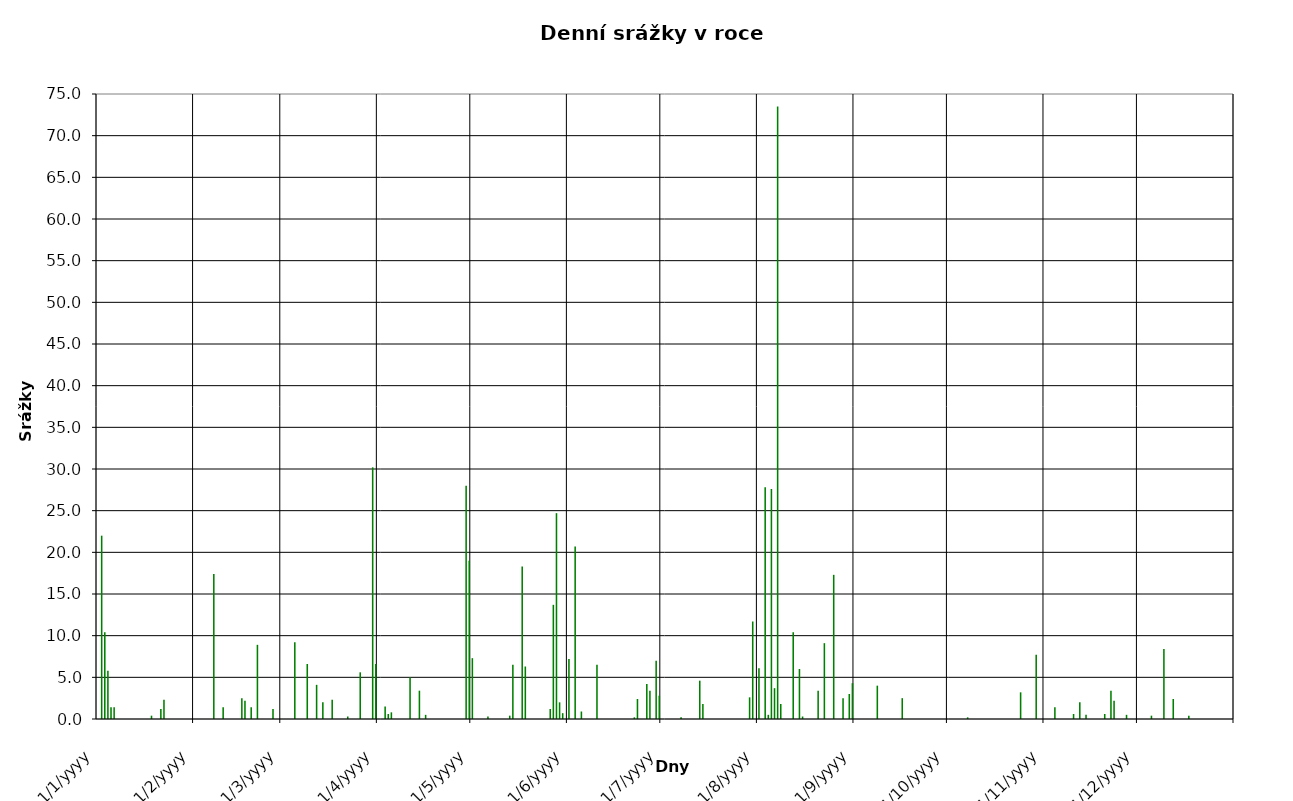
| Category | Series 0 |
|---|---|
| 2006-01-01 | 0 |
| 2006-01-02 | 22 |
| 2006-01-03 | 10.4 |
| 2006-01-04 | 5.8 |
| 2006-01-05 | 1.4 |
| 2006-01-06 | 1.4 |
| 2006-01-07 | 0 |
| 2006-01-08 | 0 |
| 2006-01-09 | 0 |
| 2006-01-10 | 0 |
| 2006-01-11 | 0 |
| 2006-01-12 | 0 |
| 2006-01-13 | 0 |
| 2006-01-14 | 0 |
| 2006-01-15 | 0 |
| 2006-01-16 | 0 |
| 2006-01-17 | 0 |
| 2006-01-18 | 0.4 |
| 2006-01-19 | 0 |
| 2006-01-20 | 0 |
| 2006-01-21 | 1.2 |
| 2006-01-22 | 2.3 |
| 2006-01-23 | 0 |
| 2006-01-24 | 0 |
| 2006-01-25 | 0 |
| 2006-01-26 | 0 |
| 2006-01-27 | 0 |
| 2006-01-28 | 0 |
| 2006-01-29 | 0 |
| 2006-01-30 | 0 |
| 2006-01-31 | 0 |
| 2006-02-01 | 0 |
| 2006-02-02 | 0 |
| 2006-02-03 | 0 |
| 2006-02-04 | 0 |
| 2006-02-05 | 0 |
| 2006-02-06 | 0 |
| 2006-02-07 | 17.4 |
| 2006-02-08 | 0 |
| 2006-02-09 | 0 |
| 2006-02-10 | 1.4 |
| 2006-02-11 | 0 |
| 2006-02-12 | 0 |
| 2006-02-13 | 0 |
| 2006-02-14 | 0 |
| 2006-02-15 | 0 |
| 2006-02-16 | 2.5 |
| 2006-02-17 | 2.2 |
| 2006-02-18 | 0 |
| 2006-02-19 | 1.4 |
| 2006-02-20 | 0 |
| 2006-02-21 | 8.9 |
| 2006-02-22 | 0 |
| 2006-02-23 | 0 |
| 2006-02-24 | 0 |
| 2006-02-25 | 0 |
| 2006-02-26 | 1.2 |
| 2006-02-27 | 0 |
| 2006-02-28 | 0 |
| 2006-03-01 | 0 |
| 2006-03-02 | 0 |
| 2006-03-03 | 0 |
| 2006-03-04 | 0 |
| 2006-03-05 | 9.2 |
| 2006-03-06 | 0 |
| 2006-03-07 | 0 |
| 2006-03-08 | 0 |
| 2006-03-09 | 6.6 |
| 2006-03-10 | 0 |
| 2006-03-11 | 0 |
| 2006-03-12 | 4.1 |
| 2006-03-13 | 0 |
| 2006-03-14 | 2 |
| 2006-03-15 | 0 |
| 2006-03-16 | 0 |
| 2006-03-17 | 2.3 |
| 2006-03-18 | 0 |
| 2006-03-19 | 0 |
| 2006-03-20 | 0 |
| 2006-03-21 | 0 |
| 2006-03-22 | 0.3 |
| 2006-03-23 | 0 |
| 2006-03-24 | 0 |
| 2006-03-25 | 0 |
| 2006-03-26 | 5.6 |
| 2006-03-27 | 0 |
| 2006-03-28 | 0 |
| 2006-03-29 | 0 |
| 2006-03-30 | 30.2 |
| 2006-03-31 | 6.6 |
| 2006-04-01 | 0 |
| 2006-04-02 | 0 |
| 2006-04-03 | 1.5 |
| 2006-04-04 | 0.6 |
| 2006-04-05 | 0.8 |
| 2006-04-06 | 0 |
| 2006-04-07 | 0 |
| 2006-04-08 | 0 |
| 2006-04-09 | 0 |
| 2006-04-10 | 0 |
| 2006-04-11 | 5 |
| 2006-04-12 | 0 |
| 2006-04-13 | 0 |
| 2006-04-14 | 3.4 |
| 2006-04-15 | 0 |
| 2006-04-16 | 0.5 |
| 2006-04-17 | 0 |
| 2006-04-18 | 0 |
| 2006-04-19 | 0 |
| 2006-04-20 | 0 |
| 2006-04-21 | 0 |
| 2006-04-22 | 0 |
| 2006-04-23 | 0 |
| 2006-04-24 | 0 |
| 2006-04-25 | 0 |
| 2006-04-26 | 0 |
| 2006-04-27 | 0 |
| 2006-04-28 | 0 |
| 2006-04-29 | 28 |
| 2006-04-30 | 19 |
| 2006-05-01 | 7.3 |
| 2006-05-02 | 0 |
| 2006-05-03 | 0 |
| 2006-05-04 | 0 |
| 2006-05-05 | 0 |
| 2006-05-06 | 0.3 |
| 2006-05-07 | 0 |
| 2006-05-08 | 0 |
| 2006-05-09 | 0 |
| 2006-05-10 | 0 |
| 2006-05-11 | 0 |
| 2006-05-12 | 0 |
| 2006-05-13 | 0.4 |
| 2006-05-14 | 6.5 |
| 2006-05-15 | 0 |
| 2006-05-16 | 0 |
| 2006-05-17 | 18.3 |
| 2006-05-18 | 6.3 |
| 2006-05-19 | 0 |
| 2006-05-20 | 0 |
| 2006-05-21 | 0 |
| 2006-05-22 | 0 |
| 2006-05-23 | 0 |
| 2006-05-24 | 0 |
| 2006-05-25 | 0 |
| 2006-05-26 | 1.2 |
| 2006-05-27 | 13.7 |
| 2006-05-28 | 24.7 |
| 2006-05-29 | 2 |
| 2006-05-30 | 0.7 |
| 2006-05-31 | 0 |
| 2006-06-01 | 7.2 |
| 2006-06-02 | 0 |
| 2006-06-03 | 20.7 |
| 2006-06-04 | 0 |
| 2006-06-05 | 0.9 |
| 2006-06-06 | 0 |
| 2006-06-07 | 0 |
| 2006-06-08 | 0 |
| 2006-06-09 | 0 |
| 2006-06-10 | 6.5 |
| 2006-06-11 | 0 |
| 2006-06-12 | 0 |
| 2006-06-13 | 0 |
| 2006-06-14 | 0 |
| 2006-06-15 | 0 |
| 2006-06-16 | 0 |
| 2006-06-17 | 0 |
| 2006-06-18 | 0 |
| 2006-06-19 | 0 |
| 2006-06-20 | 0 |
| 2006-06-21 | 0 |
| 2006-06-22 | 0.2 |
| 2006-06-23 | 2.4 |
| 2006-06-24 | 0 |
| 2006-06-25 | 0 |
| 2006-06-26 | 4.2 |
| 2006-06-27 | 3.4 |
| 2006-06-28 | 0 |
| 2006-06-29 | 7 |
| 2006-06-30 | 2.8 |
| 2006-07-01 | 0 |
| 2006-07-02 | 0 |
| 2006-07-03 | 0 |
| 2006-07-04 | 0 |
| 2006-07-05 | 0 |
| 2006-07-06 | 0 |
| 2006-07-07 | 0.2 |
| 2006-07-08 | 0 |
| 2006-07-09 | 0 |
| 2006-07-10 | 0 |
| 2006-07-11 | 0 |
| 2006-07-12 | 0 |
| 2006-07-13 | 4.6 |
| 2006-07-14 | 1.8 |
| 2006-07-15 | 0 |
| 2006-07-16 | 0 |
| 2006-07-17 | 0 |
| 2006-07-18 | 0 |
| 2006-07-19 | 0 |
| 2006-07-20 | 0 |
| 2006-07-21 | 0 |
| 2006-07-22 | 0 |
| 2006-07-23 | 0 |
| 2006-07-24 | 0 |
| 2006-07-25 | 0 |
| 2006-07-26 | 0 |
| 2006-07-27 | 0 |
| 2006-07-28 | 0 |
| 2006-07-29 | 2.6 |
| 2006-07-30 | 11.7 |
| 2006-07-31 | 0 |
| 2006-08-01 | 6.1 |
| 2006-08-02 | 0 |
| 2006-08-03 | 27.8 |
| 2006-08-04 | 0.5 |
| 2006-08-05 | 27.6 |
| 2006-08-06 | 3.7 |
| 2006-08-07 | 73.5 |
| 2006-08-08 | 1.8 |
| 2006-08-09 | 0 |
| 2006-08-10 | 0 |
| 2006-08-11 | 0 |
| 2006-08-12 | 10.4 |
| 2006-08-13 | 0 |
| 2006-08-14 | 6 |
| 2006-08-15 | 0.3 |
| 2006-08-16 | 0 |
| 2006-08-17 | 0 |
| 2006-08-18 | 0 |
| 2006-08-19 | 0 |
| 2006-08-20 | 3.4 |
| 2006-08-21 | 0 |
| 2006-08-22 | 9.1 |
| 2006-08-23 | 0 |
| 2006-08-24 | 0 |
| 2006-08-25 | 17.3 |
| 2006-08-26 | 0 |
| 2006-08-27 | 0 |
| 2006-08-28 | 2.5 |
| 2006-08-29 | 0 |
| 2006-08-30 | 3 |
| 2006-08-31 | 4.3 |
| 2006-09-01 | 0 |
| 2006-09-02 | 0 |
| 2006-09-03 | 0 |
| 2006-09-04 | 0 |
| 2006-09-05 | 0 |
| 2006-09-06 | 0 |
| 2006-09-07 | 0 |
| 2006-09-08 | 4 |
| 2006-09-09 | 0 |
| 2006-09-10 | 0 |
| 2006-09-11 | 0 |
| 2006-09-12 | 0 |
| 2006-09-13 | 0 |
| 2006-09-14 | 0 |
| 2006-09-15 | 0 |
| 2006-09-16 | 2.5 |
| 2006-09-17 | 0 |
| 2006-09-18 | 0 |
| 2006-09-19 | 0 |
| 2006-09-20 | 0 |
| 2006-09-21 | 0 |
| 2006-09-22 | 0 |
| 2006-09-23 | 0 |
| 2006-09-24 | 0 |
| 2006-09-25 | 0 |
| 2006-09-26 | 0 |
| 2006-09-27 | 0 |
| 2006-09-28 | 0 |
| 2006-09-29 | 0 |
| 2006-09-30 | 0 |
| 2006-10-01 | 0 |
| 2006-10-02 | 0 |
| 2006-10-03 | 0 |
| 2006-10-04 | 0 |
| 2006-10-05 | 0 |
| 2006-10-06 | 0 |
| 2006-10-07 | 0.2 |
| 2006-10-08 | 0 |
| 2006-10-09 | 0 |
| 2006-10-10 | 0 |
| 2006-10-11 | 0 |
| 2006-10-12 | 0 |
| 2006-10-13 | 0 |
| 2006-10-14 | 0 |
| 2006-10-15 | 0 |
| 2006-10-16 | 0 |
| 2006-10-17 | 0 |
| 2006-10-18 | 0 |
| 2006-10-19 | 0 |
| 2006-10-20 | 0 |
| 2006-10-21 | 0 |
| 2006-10-22 | 0 |
| 2006-10-23 | 0 |
| 2006-10-24 | 3.2 |
| 2006-10-25 | 0 |
| 2006-10-26 | 0 |
| 2006-10-27 | 0 |
| 2006-10-28 | 0 |
| 2006-10-29 | 7.7 |
| 2006-10-30 | 0 |
| 2006-10-31 | 0 |
| 2006-11-01 | 0 |
| 2006-11-02 | 0 |
| 2006-11-03 | 0 |
| 2006-11-04 | 1.4 |
| 2006-11-05 | 0 |
| 2006-11-06 | 0 |
| 2006-11-07 | 0 |
| 2006-11-08 | 0 |
| 2006-11-09 | 0 |
| 2006-11-10 | 0.6 |
| 2006-11-11 | 0 |
| 2006-11-12 | 2 |
| 2006-11-13 | 0 |
| 2006-11-14 | 0.5 |
| 2006-11-15 | 0 |
| 2006-11-16 | 0 |
| 2006-11-17 | 0 |
| 2006-11-18 | 0 |
| 2006-11-19 | 0 |
| 2006-11-20 | 0.6 |
| 2006-11-21 | 0 |
| 2006-11-22 | 3.4 |
| 2006-11-23 | 2.2 |
| 2006-11-24 | 0 |
| 2006-11-25 | 0 |
| 2006-11-26 | 0 |
| 2006-11-27 | 0.5 |
| 2006-11-28 | 0 |
| 2006-11-29 | 0 |
| 2006-11-30 | 0 |
| 2006-12-01 | 0 |
| 2006-12-02 | 0 |
| 2006-12-03 | 0 |
| 2006-12-04 | 0 |
| 2006-12-05 | 0.4 |
| 2006-12-06 | 0 |
| 2006-12-07 | 0 |
| 2006-12-08 | 0 |
| 2006-12-09 | 8.4 |
| 2006-12-10 | 0 |
| 2006-12-11 | 0 |
| 2006-12-12 | 2.4 |
| 2006-12-13 | 0 |
| 2006-12-14 | 0 |
| 2006-12-15 | 0 |
| 2006-12-16 | 0 |
| 2006-12-17 | 0.4 |
| 2006-12-18 | 0 |
| 2006-12-19 | 0 |
| 2006-12-20 | 0 |
| 2006-12-21 | 0 |
| 2006-12-22 | 0 |
| 2006-12-23 | 0 |
| 2006-12-24 | 0 |
| 2006-12-25 | 0 |
| 2006-12-26 | 0 |
| 2006-12-27 | 0 |
| 2006-12-28 | 0 |
| 2006-12-29 | 0 |
| 2006-12-30 | 0 |
| 2006-12-31 | 0 |